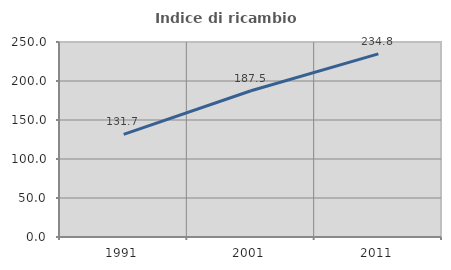
| Category | Indice di ricambio occupazionale  |
|---|---|
| 1991.0 | 131.655 |
| 2001.0 | 187.5 |
| 2011.0 | 234.821 |